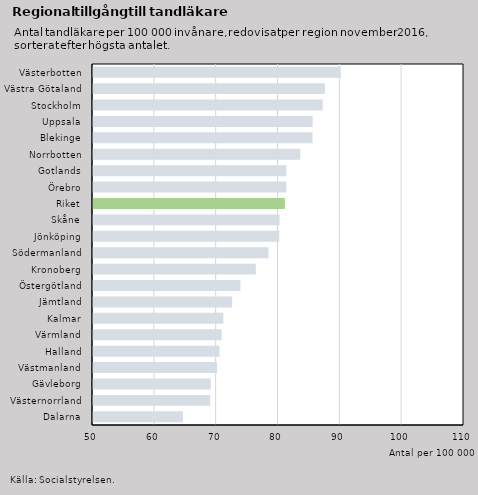
| Category | Region |
|---|---|
| Dalarna | 64.54 |
| Västernorrland | 68.961 |
| Gävleborg | 69.025 |
| Västmanland | 70.056 |
| Halland | 70.466 |
| Värmland | 70.799 |
| Kalmar | 71.076 |
| Jämtland | 72.5 |
| Östergötland | 73.84 |
| Kronoberg | 76.326 |
| Södermanland | 78.374 |
| Jönköping | 80.113 |
| Skåne | 80.172 |
| Riket | 81.032 |
| Örebro | 81.252 |
| Gotlands | 81.267 |
| Norrbotten | 83.518 |
| Blekinge | 85.503 |
| Uppsala | 85.526 |
| Stockholm | 87.142 |
| Västra Götaland | 87.51 |
| Västerbotten | 90.068 |